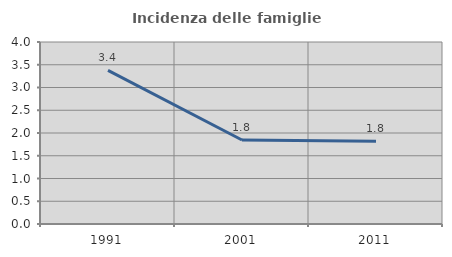
| Category | Incidenza delle famiglie numerose |
|---|---|
| 1991.0 | 3.377 |
| 2001.0 | 1.846 |
| 2011.0 | 1.817 |